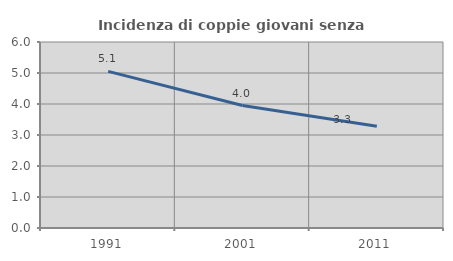
| Category | Incidenza di coppie giovani senza figli |
|---|---|
| 1991.0 | 5.053 |
| 2001.0 | 3.95 |
| 2011.0 | 3.282 |